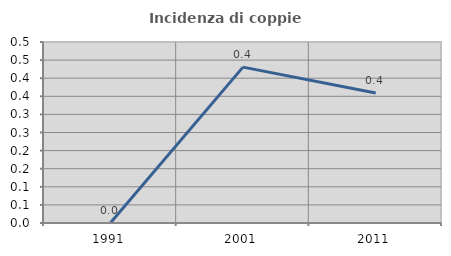
| Category | Incidenza di coppie miste |
|---|---|
| 1991.0 | 0 |
| 2001.0 | 0.431 |
| 2011.0 | 0.359 |